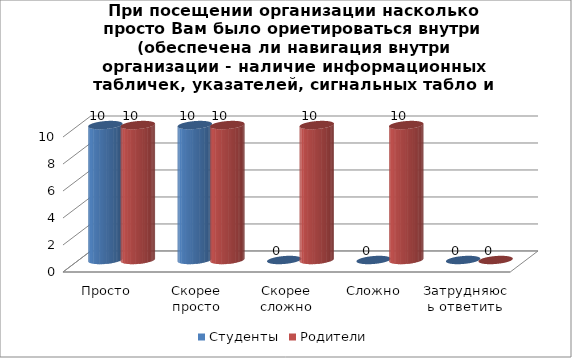
| Category | Студенты | Родители |
|---|---|---|
| Просто | 10 | 10 |
| Скорее просто | 10 | 10 |
| Скорее сложно | 0 | 10 |
| Сложно | 0 | 10 |
| Затрудняюсь ответить | 0 | 0 |